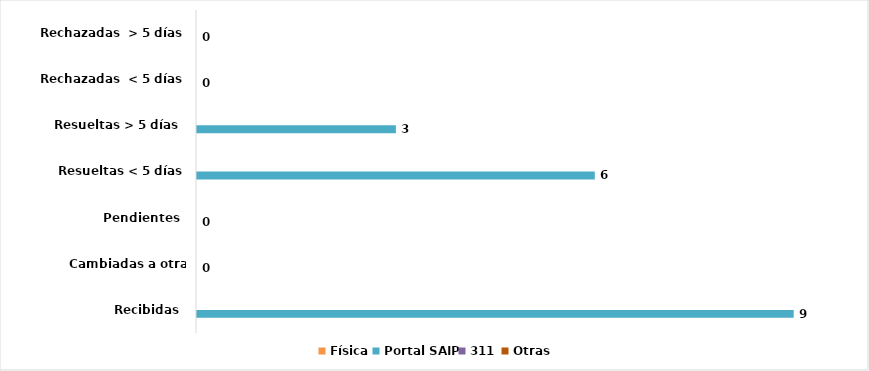
| Category | Física | Portal SAIP | 311 | Otras |
|---|---|---|---|---|
| Recibidas  | 0 | 9 | 0 | 0 |
| Cambiadas a otra Institución | 0 | 0 | 0 | 0 |
| Pendientes  | 0 | 0 | 0 | 0 |
| Resueltas < 5 días | 0 | 6 | 0 | 0 |
| Resueltas > 5 días  | 0 | 3 | 0 | 0 |
| Rechazadas  < 5 días | 0 | 0 | 0 | 0 |
| Rechazadas  > 5 días | 0 | 0 | 0 | 0 |